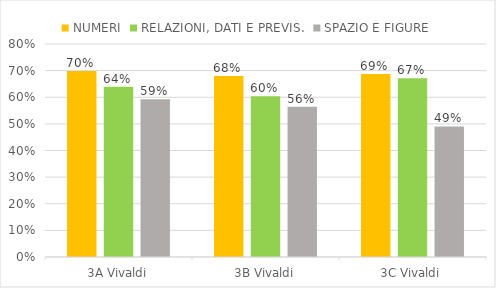
| Category | NUMERI | RELAZIONI, DATI E PREVIS. | SPAZIO E FIGURE |
|---|---|---|---|
| 3A Vivaldi | 0.698 | 0.639 | 0.593 |
| 3B Vivaldi | 0.679 | 0.604 | 0.565 |
| 3C Vivaldi | 0.688 | 0.672 | 0.491 |